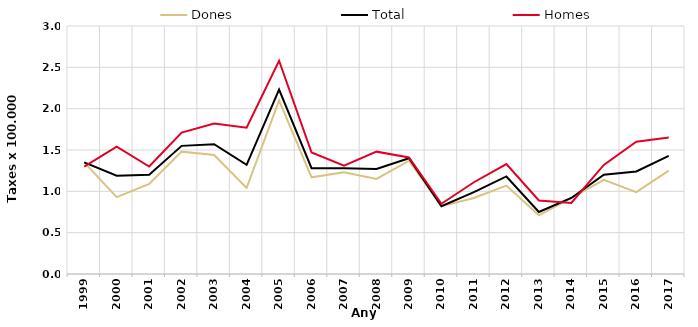
| Category | Dones | Total | Homes |
|---|---|---|---|
| 1999.0 | 1.35 | 1.35 | 1.3 |
| 2000.0 | 0.93 | 1.19 | 1.54 |
| 2001.0 | 1.09 | 1.2 | 1.3 |
| 2002.0 | 1.48 | 1.55 | 1.71 |
| 2003.0 | 1.44 | 1.57 | 1.82 |
| 2004.0 | 1.04 | 1.32 | 1.77 |
| 2005.0 | 2.1 | 2.23 | 2.58 |
| 2006.0 | 1.17 | 1.28 | 1.47 |
| 2007.0 | 1.23 | 1.28 | 1.31 |
| 2008.0 | 1.15 | 1.27 | 1.48 |
| 2009.0 | 1.37 | 1.4 | 1.41 |
| 2010.0 | 0.82 | 0.82 | 0.85 |
| 2011.0 | 0.92 | 0.99 | 1.11 |
| 2012.0 | 1.07 | 1.18 | 1.33 |
| 2013.0 | 0.71 | 0.75 | 0.89 |
| 2014.0 | 0.92 | 0.92 | 0.86 |
| 2015.0 | 1.14 | 1.2 | 1.32 |
| 2016.0 | 0.99 | 1.24 | 1.6 |
| 2017.0 | 1.25 | 1.43 | 1.65 |